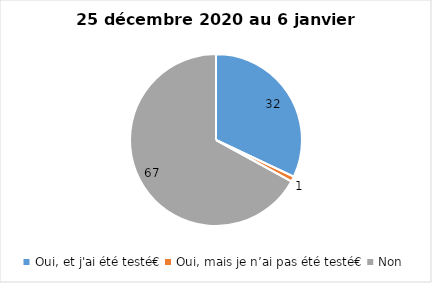
| Category | Series 0 |
|---|---|
| Oui, et j'ai été testé€ | 32 |
| Oui, mais je n’ai pas été testé€ | 1 |
| Non | 67 |